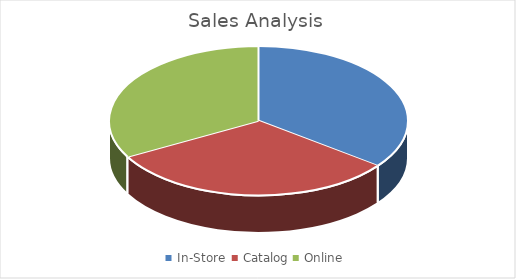
| Category | Series 0 |
|---|---|
| In-Store  | 284290.41 |
| Catalog | 254744.72 |
| Online | 265706.76 |